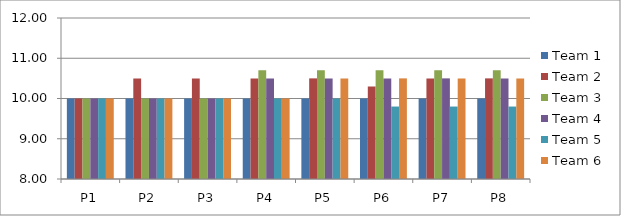
| Category | Team 1 | Team 2 | Team 3 | Team 4 | Team 5 | Team 6 |
|---|---|---|---|---|---|---|
| P1 | 10 | 10 | 10 | 10 | 10 | 10 |
| P2 | 10 | 10.5 | 10 | 10 | 10 | 10 |
| P3 | 10 | 10.5 | 10 | 10 | 10 | 10 |
| P4 | 10 | 10.5 | 10.7 | 10.5 | 10 | 10 |
| P5 | 10 | 10.5 | 10.7 | 10.5 | 10 | 10.5 |
| P6 | 10 | 10.3 | 10.7 | 10.5 | 9.8 | 10.5 |
| P7 | 10 | 10.5 | 10.7 | 10.5 | 9.8 | 10.5 |
| P8 | 10 | 10.5 | 10.7 | 10.5 | 9.8 | 10.5 |